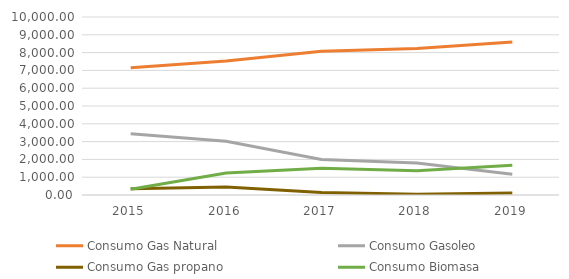
| Category | Consumo Gas Natural | Consumo Gasoleo | Consumo Gas propano | Consumo Biomasa |
|---|---|---|---|---|
| 2015.0 | 7148.77 | 3442.753 | 349.816 | 324.59 |
| 2016.0 | 7525.71 | 3020.131 | 443.033 | 1240.846 |
| 2017.0 | 8080.076 | 1998.899 | 145.773 | 1498.609 |
| 2018.0 | 8225.553 | 1802.348 | 39.569 | 1366.364 |
| 2019.0 | 8600.568 | 1170.121 | 109.595 | 1671.752 |